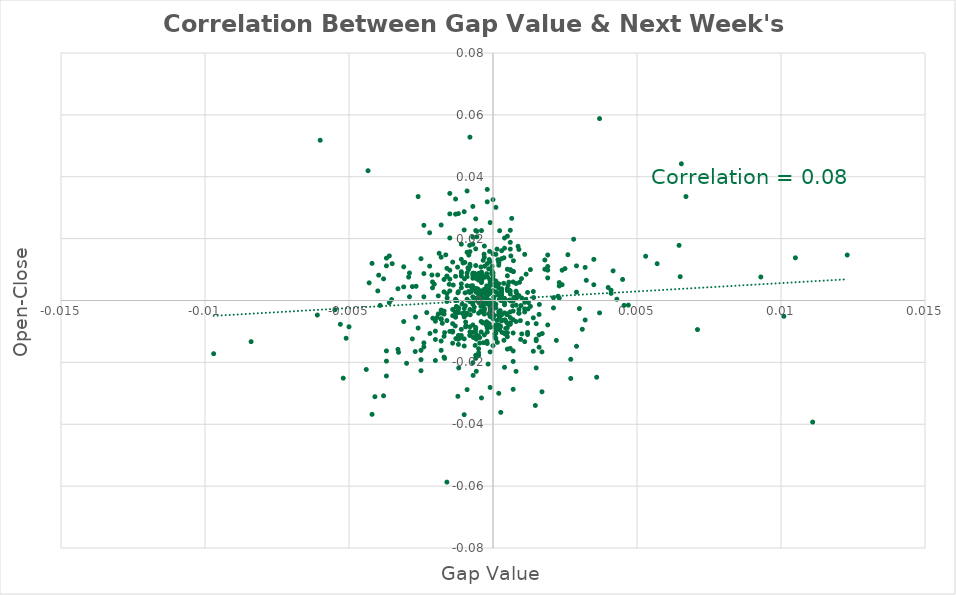
| Category | Series 0 |
|---|---|
| -0.00107000000000001 | -0.001 |
| -0.000199999999999978 | 0 |
| -0.000219999999999998 | 0.009 |
| -2.99999999999744e-05 | 0.01 |
| -0.000619999999999953 | -0.015 |
| -0.00168000000000001 | -0.019 |
| -0.000559999999999893 | 0.022 |
| -0.000340000000000007 | -0.002 |
| -0.00126999999999999 | -0.002 |
| 0.000290000000000012 | 0.002 |
| 0.00048999999999999 | 0.004 |
| -0.000630000000000019 | 0.009 |
| -0.000580000000000024 | 0.003 |
| -0.00152000000000007 | 0.005 |
| 0.000439999999999995 | -0.011 |
| 0.000229999999999952 | 0.023 |
| -0.00119999999999997 | 0.003 |
| 0.000249999999999972 | -0.003 |
| -0.000170000000000003 | 0.002 |
| -0.000750000000000028 | 0.005 |
| 0.000990000000000046 | 0.007 |
| 0.000379999999999935 | -0.013 |
| -0.000850000000000017 | 0.003 |
| -0.000650000000000039 | -0.002 |
| -0.000460000000000016 | -0.012 |
| -0.000359999999999915 | -0.002 |
| -0.000809999999999977 | 0.003 |
| -0.00292999999999998 | 0.008 |
| 2.99999999999744e-05 | 0.001 |
| 0.000950000000000006 | -0.007 |
| 0.000240000000000018 | 0.002 |
| 0.000140000000000029 | 0.017 |
| 5.99999999999489e-05 | -0.011 |
| -0.0011000000000001 | -0.009 |
| -0.00194000000000005 | -0.005 |
| -0.000390000000000001 | 0.007 |
| -3.99999999999289e-05 | -0.001 |
| -0.00138000000000004 | 0.005 |
| -0.000219999999999998 | -0.007 |
| 9.99999999999889e-05 | -0.01 |
| -0.00392000000000003 | -0.002 |
| 0.00149999999999994 | -0.007 |
| 0.000309999999999921 | -0.01 |
| 0.000480000000000036 | -0.005 |
| -0.000210000000000043 | -0.008 |
| -0.000340000000000007 | -0.004 |
| 0.00113999999999991 | 0 |
| -0.000689999999999968 | -0.024 |
| -2.99999999999744e-05 | 0.011 |
| -0.000950000000000006 | -0.007 |
| -0.00163999999999997 | 0.015 |
| -0.000230000000000063 | -0.008 |
| -0.000329999999999941 | -0.014 |
| 0.000650000000000039 | 0.027 |
| -0.000960000000000071 | -0.002 |
| -0.000280000000000058 | 0 |
| -0.000990000000000046 | 0.007 |
| -0.00119000000000002 | -0.022 |
| -0.0012899999999999 | 0 |
| -0.000109999999999943 | -0.001 |
| -0.00170000000000003 | -0.003 |
| -0.00209000000000003 | -0.006 |
| -0.00114999999999998 | -0.012 |
| -2.000000000002e-05 | -0.005 |
| -0.00127999999999994 | -0.002 |
| -0.000800000000000022 | -0.009 |
| -0.00268999999999997 | -0.005 |
| -0.00352000000000007 | 0 |
| -0.00048999999999999 | 0.009 |
| -0.00121999999999999 | -0.031 |
| -0.000460000000000016 | -0.014 |
| 7.00000000000145e-05 | -0.012 |
| -0.000870000000000037 | 0.011 |
| -0.00129000000000001 | -0.012 |
| -0.00190000000000001 | -0.004 |
| -0.000310000000000032 | -0.004 |
| -0.000419999999999975 | -0.002 |
| 0.00146999999999997 | -0.034 |
| -0.00186999999999992 | 0.015 |
| 0.000269999999999992 | -0.036 |
| 0.00653999999999999 | 0.044 |
| -0.00433999999999989 | 0.042 |
| -0.00327999999999995 | -0.017 |
| -0.00397000000000002 | 0.008 |
| 0.000710000000000099 | 0.009 |
| -0.00097999999999998 | -0.005 |
| -0.000369999999999981 | 0.001 |
| -0.00139999999999995 | 0.012 |
| -0.000219999999999998 | 0.005 |
| -0.000249999999999972 | 0.002 |
| -0.000719999999999942 | 0.004 |
| -0.000129999999999963 | 0.003 |
| -0.000600000000000044 | -0.009 |
| 0.000969999999999915 | -0.002 |
| -0.00106000000000006 | -0.004 |
| 0.00119999999999997 | -0.007 |
| 0.000560000000000004 | 0.003 |
| -0.000750000000000028 | 0.003 |
| -0.000329999999999941 | 0.003 |
| 9.99999999999889e-05 | 0.006 |
| 0.000200000000000089 | -0.009 |
| -0.000969999999999915 | 0.002 |
| -0.000410000000000021 | -0.007 |
| -0.00125000000000008 | -0.004 |
| -0.000369999999999981 | 0 |
| 0.000800000000000022 | 0.001 |
| -0.00150000000000005 | 0.01 |
| -0.00119999999999997 | -0.004 |
| -0.00121000000000004 | -0.013 |
| -0.00126999999999999 | 0 |
| 9.99999999999889e-05 | 0.003 |
| -0.000329999999999941 | 0 |
| -0.000560000000000004 | 0.001 |
| -0.000419999999999975 | 0.011 |
| -0.000340000000000007 | 0.013 |
| 2.99999999999744e-05 | -0.002 |
| -0.000140000000000029 | -0.004 |
| 0.000520000000000076 | 0.005 |
| 0.000439999999999995 | -0.009 |
| 0.000219999999999998 | -0.005 |
| 0.000170000000000003 | 0.013 |
| 0.000139999999999918 | -0.006 |
| 0.000599999999999933 | 0 |
| 0.00455000000000005 | -0.002 |
| -0.00097999999999998 | 0.012 |
| -0.00548999999999999 | -0.003 |
| -0.000219999999999998 | 0.001 |
| -0.000290000000000012 | 0.011 |
| -0.000149999999999983 | 0.002 |
| -0.000360000000000027 | -0.007 |
| 0.00225999999999992 | 0.001 |
| 3.00000000000855e-05 | -0.001 |
| 0.000220000000000109 | 0 |
| -0.000789999999999957 | -0.005 |
| 0.00324000000000002 | 0.007 |
| 0.000920000000000031 | 0.006 |
| -0.000390000000000001 | 0.001 |
| -9.99999999999889e-05 | -0.005 |
| -0.000120000000000009 | 0.016 |
| -0.000340000000000007 | -0.007 |
| 0.000400000000000067 | -0.001 |
| -0.000709999999999988 | 0.005 |
| -0.000410000000000021 | -0.01 |
| 0.000529999999999919 | -0.008 |
| 0.000569999999999959 | 0 |
| -0.000300000000000078 | 0.014 |
| -0.00158999999999998 | 0.001 |
| 0.00646000000000002 | 0.018 |
| 4.99999999999944e-05 | -0.009 |
| -0.00212000000000001 | 0.008 |
| -0.000569999999999959 | -0.011 |
| -0.000670000000000059 | -0.003 |
| 0.000400000000000067 | -0.011 |
| -0.000580000000000024 | 0.003 |
| -0.00046999999999997 | -0.001 |
| 0.000410000000000021 | -0.006 |
| 0.000870000000000037 | 0.018 |
| -0.00266999999999995 | 0.005 |
| 0.000149999999999983 | -0.014 |
| 4.000000000004e-05 | -0.005 |
| -4.99999999999944e-05 | 0.009 |
| -0.000129999999999963 | 0.013 |
| -0.000329999999999941 | -0.001 |
| -0.00180000000000002 | -0.004 |
| -0.000149999999999983 | 0.01 |
| -0.000240000000000018 | 0 |
| 0.000159999999999938 | 0.002 |
| -0.000399999999999955 | 0 |
| 0.000719999999999942 | 0.001 |
| -4.000000000004e-05 | -0.002 |
| -0.000459999999999904 | 0.003 |
| -0.000139999999999918 | 0 |
| -0.000839999999999951 | 0.015 |
| -0.000430000000000041 | -0.003 |
| 0.00122999999999995 | -0.001 |
| 0.00121999999999999 | -0.003 |
| 0.0 | 0.003 |
| 0.000290000000000012 | 0 |
| -0.000539999999999984 | 0.004 |
| -0.000380000000000047 | 0.008 |
| 0.000609999999999999 | 0.01 |
| 0.000260000000000038 | -0.008 |
| 0.000829999999999997 | 0.001 |
| 0.000809999999999977 | 0.002 |
| 0.000179999999999958 | 0.002 |
| 0.000379999999999935 | 0.014 |
| -9.00000000000345e-05 | -0.009 |
| -0.000190000000000023 | 0.008 |
| -0.000109999999999943 | 0.007 |
| 0.000229999999999952 | -0.009 |
| -0.000849999999999906 | 0.01 |
| -0.000809999999999977 | 0.018 |
| 0.00170999999999998 | -0.011 |
| -0.00131000000000003 | -0.008 |
| 0.0 | -0.005 |
| 0.000480000000000036 | -0.007 |
| -0.000210000000000043 | -0.013 |
| -0.00192000000000003 | 0.008 |
| 0.000400000000000067 | 0 |
| 0.000189999999999912 | -0.005 |
| -0.000690000000000079 | 0.009 |
| 2.000000000002e-05 | -0.001 |
| -0.000390000000000001 | 0.002 |
| 0.000619999999999953 | 0.014 |
| -0.000540000000000096 | 0.007 |
| -0.000680000000000013 | -0.012 |
| 0.000549999999999939 | 0.006 |
| -0.00103999999999993 | 0.012 |
| -0.000279999999999947 | 0.004 |
| 0.000370000000000092 | 0.006 |
| -0.00219000000000002 | -0.011 |
| -0.000950000000000006 | -0.005 |
| -6.000000000006e-05 | -0.001 |
| -7.00000000000145e-05 | -0.004 |
| -0.00121999999999999 | 0.003 |
| -0.000900000000000011 | 0.005 |
| -0.000940000000000051 | -0.008 |
| -8.99999999999234e-05 | -0.009 |
| -0.000580000000000024 | -0.023 |
| -0.00051000000000001 | 0.008 |
| -0.000580000000000024 | -0.013 |
| -0.000109999999999943 | 0.005 |
| 0.000249999999999972 | -0.009 |
| -0.00168000000000001 | -0.01 |
| -0.000800000000000022 | 0 |
| -0.000630000000000019 | 0 |
| 0.000430000000000041 | -0.007 |
| -0.000400000000000067 | 0.002 |
| -0.00204000000000004 | 0.005 |
| 0.00417 | 0.01 |
| -0.000199999999999978 | 0.003 |
| -0.000950000000000006 | -0.009 |
| -0.000110000000000054 | 0.013 |
| 0.00141000000000002 | 0.001 |
| -0.000369999999999981 | 0.008 |
| 0.000500000000000056 | -0.016 |
| -0.000770000000000048 | 0.005 |
| 0.00115000000000009 | 0.009 |
| 0.000279999999999947 | 0 |
| 0.000279999999999947 | 0.001 |
| -0.000569999999999959 | 0 |
| 0.00095999999999996 | -0.013 |
| -0.000379999999999935 | 0 |
| -0.00175999999999998 | -0.007 |
| -0.000170000000000003 | -0.021 |
| -0.000699999999999922 | -0.01 |
| -0.00130999999999992 | -0.004 |
| -0.00122999999999995 | 0.011 |
| -0.000309999999999921 | 0.015 |
| -0.000589999999999979 | 0 |
| 0.000680000000000013 | -0.002 |
| -0.000609999999999999 | -0.01 |
| -0.000560000000000004 | 0.021 |
| 0.000709999999999988 | 0.013 |
| -0.000129999999999963 | -0.007 |
| 3.00000000000855e-05 | 0.001 |
| 0.000269999999999992 | 0.001 |
| 0.00161 | -0.001 |
| 0.0 | 0.007 |
| -0.000499999999999944 | -0.004 |
| -0.00119999999999997 | -0.014 |
| 9.99999999999889e-05 | 0.005 |
| -0.000299999999999967 | 0.003 |
| -0.000399999999999955 | -0.001 |
| -0.00209999999999999 | 0.004 |
| 0.000599999999999933 | 0.003 |
| -0.0001000000000001 | -0.003 |
| -0.001 | -0.003 |
| -0.000199999999999978 | -0.014 |
| 0.00179999999999991 | 0.013 |
| -0.000200000000000089 | -0.001 |
| -0.00509999999999999 | -0.012 |
| -0.00529999999999997 | -0.008 |
| 0.00369999999999992 | -0.004 |
| -9.99999999999889e-05 | -0.002 |
| 0.000399999999999955 | -0.001 |
| -0.000600000000000044 | -0.019 |
| 0.000200000000000089 | 0.004 |
| -0.00150000000000005 | 0.003 |
| -0.00109999999999999 | 0.009 |
| -0.001 | 0.023 |
| -0.00109999999999999 | 0.009 |
| -0.00609999999999999 | -0.005 |
| -0.000600000000000044 | -0.018 |
| -0.000799999999999911 | 0.012 |
| 0.000699999999999922 | -0.016 |
| -0.000700000000000033 | 0.009 |
| -0.00129999999999996 | -0.005 |
| -0.00330000000000008 | -0.016 |
| -0.000400000000000067 | -0.032 |
| 0.000800000000000022 | 0.003 |
| -0.000299999999999967 | -0.004 |
| 0.000599999999999933 | -0.004 |
| -0.000200000000000089 | 0.002 |
| 9.99999999999889e-05 | -0.008 |
| -0.00179999999999991 | -0.016 |
| 0.00190000000000001 | 0.011 |
| -0.00259999999999993 | 0.034 |
| 0.000700000000000033 | -0.003 |
| -0.000199999999999978 | -0.01 |
| 0.00139999999999995 | 0.003 |
| 0.0 | 0.015 |
| 0.0 | -0.015 |
| -0.000700000000000033 | 0.004 |
| -0.000500000000000056 | -0.012 |
| -0.00149999999999994 | -0.01 |
| -0.00160000000000004 | 0.008 |
| -0.000700000000000033 | 0.007 |
| -0.00109999999999999 | 0.004 |
| -0.00109999999999999 | 0.005 |
| -9.99999999999889e-05 | -0.028 |
| -9.99999999999889e-05 | -0.002 |
| -0.0008999999999999 | 0.016 |
| -0.00109999999999999 | -0.011 |
| 0.00170000000000003 | -0.017 |
| -0.00180000000000002 | 0.024 |
| -0.00109999999999999 | 0.013 |
| 9.99999999999889e-05 | 0.006 |
| -0.000600000000000044 | 0.004 |
| 0.001 | -0.011 |
| -0.00119999999999997 | -0.003 |
| 0.000700000000000033 | 0.009 |
| -0.00279999999999991 | 0.005 |
| -0.004 | 0.003 |
| -0.00309999999999999 | 0.011 |
| -0.000800000000000022 | 0.011 |
| 0.00209999999999999 | -0.002 |
| 0.000499999999999944 | -0.01 |
| -0.000499999999999944 | 0.002 |
| -0.000700000000000033 | 0.018 |
| 0.000499999999999944 | 0.021 |
| -0.00119999999999997 | -0.011 |
| -0.00139999999999995 | -0.01 |
| 9.99999999999889e-05 | -0.002 |
| 0.00429999999999997 | 0 |
| -0.000799999999999911 | -0.011 |
| 0.00109999999999999 | -0.004 |
| -0.00160000000000004 | 0.01 |
| 0.00229999999999996 | 0.005 |
| -0.001 | -0.015 |
| -0.000299999999999967 | 0.008 |
| -0.000400000000000067 | 0.009 |
| 0.000299999999999967 | 0.004 |
| 0.000600000000000044 | -0.007 |
| -0.00359999999999993 | -0.001 |
| -0.001 | -0.004 |
| -0.00370000000000003 | 0.011 |
| -0.000700000000000033 | 0.03 |
| 0.000799999999999911 | -0.002 |
| -0.00239999999999995 | -0.014 |
| 0.000300000000000078 | 0.003 |
| -9.99999999999889e-05 | 0.002 |
| 0.000500000000000056 | 0.01 |
| -0.00170000000000003 | 0.007 |
| -0.00360000000000004 | 0.014 |
| 0.000399999999999955 | 0.017 |
| 0.00249999999999994 | 0.01 |
| 0.00120000000000009 | -0.01 |
| -0.00419999999999998 | 0.012 |
| 0.000399999999999955 | 0.001 |
| 0.000900000000000011 | -0.004 |
| 0.000599999999999933 | -0.006 |
| 0.0001000000000001 | -0.001 |
| -0.00109999999999999 | 0.008 |
| 0.000600000000000044 | 0.017 |
| -0.00239999999999995 | 0.009 |
| -0.00129999999999996 | 0.033 |
| -0.00129999999999996 | -0.005 |
| -0.000800000000000022 | -0.003 |
| -0.000399999999999955 | 0 |
| 0.0 | -0.004 |
| -0.000499999999999944 | 0.004 |
| 0.0 | 0.008 |
| 0.000299999999999967 | 0 |
| -0.000699999999999922 | -0.001 |
| -0.000300000000000078 | -0.003 |
| -9.99999999999889e-05 | 0.006 |
| -0.000900000000000011 | -0.005 |
| 0.000300000000000078 | 0.002 |
| 0.000299999999999967 | -0.006 |
| -0.000300000000000078 | -0.003 |
| 0.000199999999999978 | -0.008 |
| 0.000299999999999967 | 0.013 |
| -0.000199999999999978 | -0.001 |
| 0.000600000000000044 | -0.008 |
| -0.000699999999999922 | 0 |
| 0.0 | 0.005 |
| -0.000400000000000067 | 0.006 |
| -0.000800000000000022 | -0.011 |
| 0.000400000000000067 | -0.004 |
| 0.00159999999999993 | -0.015 |
| -0.00160000000000004 | -0.007 |
| -0.00160000000000004 | 0.002 |
| -0.00270000000000003 | -0.017 |
| -0.000599999999999933 | 0.004 |
| 0.00190000000000001 | 0.007 |
| -0.000700000000000033 | -0.008 |
| 0.000700000000000033 | -0.02 |
| 0.000700000000000033 | -0.006 |
| -0.000900000000000011 | 0.009 |
| -0.000699999999999922 | 0.021 |
| 0.000300000000000078 | -0.005 |
| -0.002 | -0.01 |
| 0.000199999999999978 | 0.005 |
| -0.00170000000000003 | 0.003 |
| 0.00109999999999999 | 0.015 |
| 0.0008999999999999 | 0.002 |
| -0.000400000000000067 | 0.006 |
| 0.000400000000000067 | 0.02 |
| -0.000400000000000067 | 0.001 |
| 0.000700000000000033 | 0.006 |
| 9.99999999999889e-05 | 0.015 |
| -0.00130000000000007 | 0.008 |
| -0.00369999999999992 | -0.024 |
| 0.000200000000000089 | -0.004 |
| -0.001 | -0.012 |
| -0.00209999999999999 | 0.006 |
| 0.0101 | -0.005 |
| 0.00160000000000004 | -0.004 |
| 0.00270000000000003 | -0.025 |
| 0.000199999999999978 | 0.012 |
| 0.000299999999999967 | 0.016 |
| -0.00159999999999993 | 0 |
| 0.000700000000000033 | -0.029 |
| -0.000900000000000011 | 0.035 |
| 0.000499999999999944 | -0.009 |
| 0.0031000000000001 | -0.009 |
| -0.00129999999999996 | 0 |
| -0.000499999999999944 | 0.007 |
| 0.00239999999999995 | 0.01 |
| -0.000199999999999978 | 0.036 |
| -0.00970000000000004 | -0.017 |
| 0.00320000000000009 | 0.011 |
| 0.000499999999999944 | 0.008 |
| 0.00290000000000001 | 0.011 |
| -0.00150000000000005 | 0.028 |
| -0.00120000000000009 | 0.028 |
| 0.0008999999999999 | -0.003 |
| -0.000199999999999978 | 0 |
| -0.000599999999999933 | 0.023 |
| -0.00140000000000006 | -0.014 |
| -0.000800000000000133 | 0.003 |
| 0.000299999999999967 | 0.003 |
| -0.00499999999999989 | -0.008 |
| -0.00300000000000011 | -0.02 |
| -0.000399999999999955 | -0.004 |
| -0.00290000000000012 | 0.009 |
| -0.00229999999999996 | -0.004 |
| -0.000900000000000122 | 0 |
| 0.00130000000000007 | 0.01 |
| -0.000699999999999922 | 0.001 |
| -0.0008999999999999 | 0.008 |
| -0.000299999999999967 | 0.002 |
| 0.00299999999999989 | -0.003 |
| 9.99999999999889e-05 | -0.011 |
| 0.000499999999999944 | 0.003 |
| -0.000799999999999911 | 0.016 |
| -0.000199999999999978 | -0.008 |
| 0.0 | -0.006 |
| -0.000199999999999978 | 0.003 |
| 0.00119999999999986 | -0.011 |
| 0.000799999999999911 | 0.005 |
| 0.000499999999999944 | -0.004 |
| -0.00239999999999995 | 0.001 |
| -0.000999999999999889 | -0.005 |
| 0.00190000000000001 | -0.008 |
| -0.002 | -0.007 |
| -0.0011000000000001 | 0.018 |
| -0.000600000000000156 | 0.007 |
| 0.000600000000000156 | 0.01 |
| -0.00170000000000003 | -0.018 |
| -0.00259999999999993 | -0.009 |
| 0.00180000000000002 | 0.01 |
| 0.00119999999999986 | 0.003 |
| -0.00180000000000002 | 0.014 |
| 0.000699999999999922 | 0 |
| -0.00140000000000006 | -0.01 |
| -0.002 | -0.013 |
| 0.00219999999999998 | -0.013 |
| -0.00139999999999984 | -0.003 |
| 0.00239999999999995 | 0.005 |
| -0.002 | -0.019 |
| 0.00350000000000005 | 0.005 |
| 0.0071000000000001 | -0.009 |
| 0.000399999999999955 | -0.022 |
| 0.00569999999999992 | 0.012 |
| -0.000700000000000033 | 0.008 |
| -0.000599999999999933 | 0.017 |
| -0.00249999999999994 | 0.014 |
| -0.00129999999999985 | 0.028 |
| -0.000800000000000133 | -0.01 |
| 0.0 | -0.001 |
| -0.00139999999999984 | -0.007 |
| 0.0104999999999999 | 0.014 |
| -0.000199999999999978 | 0.012 |
| 0.000199999999999978 | 0.013 |
| -0.00180000000000002 | -0.003 |
| 0.000900000000000122 | 0.016 |
| 0.0011000000000001 | -0.003 |
| 0.00649999999999995 | 0.008 |
| 0.00130000000000007 | -0.002 |
| -0.00160000000000004 | 0.008 |
| -0.00180000000000002 | -0.013 |
| -0.000499999999999944 | -0.018 |
| -0.00370000000000003 | -0.02 |
| -0.00279999999999991 | -0.012 |
| 0.0011000000000001 | -0.001 |
| 0.000299999999999967 | -0.007 |
| 0.000600000000000044 | -0.015 |
| -0.000399999999999955 | 0.023 |
| 0.004 | 0.004 |
| 0.0111 | -0.039 |
| -0.000999999999999889 | 0.029 |
| 0.00669999999999992 | 0.034 |
| 0.00349999999999983 | 0.013 |
| 0.0 | 0.033 |
| -0.0042000000000002 | -0.037 |
| -0.00140000000000006 | -0.005 |
| -0.00160000000000004 | -0.059 |
| -0.000299999999999967 | -0.011 |
| 0.00260000000000004 | 0.015 |
| -0.006 | 0.052 |
| -0.00380000000000002 | 0.007 |
| -0.00370000000000003 | 0.014 |
| 0.00140000000000006 | -0.006 |
| -0.00249999999999994 | -0.019 |
| 0.0008999999999999 | -0.004 |
| -0.00150000000000005 | 0.007 |
| 0.00370000000000003 | 0.059 |
| -0.00249999999999994 | -0.016 |
| -0.00249999999999994 | -0.023 |
| -0.00429999999999997 | 0.006 |
| 0.000599999999999933 | 0.002 |
| -0.0008999999999999 | -0.029 |
| -0.00219999999999998 | 0.011 |
| -0.000600000000000156 | -0.009 |
| -0.000299999999999967 | 0.018 |
| 0.00229999999999996 | 0.001 |
| -0.00180000000000002 | -0.006 |
| 0.000199999999999978 | -0.009 |
| 0.00190000000000001 | 0.015 |
| -0.000599999999999933 | 0.026 |
| 0.000800000000000133 | -0.023 |
| -0.000499999999999944 | -0.017 |
| 0.0 | 0 |
| 0.00140000000000006 | -0.016 |
| -0.00239999999999995 | -0.015 |
| 0.000199999999999978 | -0.03 |
| 0.000599999999999933 | 0.019 |
| 0.000999999999999889 | 0.001 |
| -0.00290000000000012 | 0.001 |
| -0.0008999999999999 | -0.004 |
| -0.00370000000000003 | -0.016 |
| -0.000599999999999933 | 0.011 |
| -0.00519999999999998 | -0.025 |
| -0.00180000000000002 | -0.006 |
| 0.00209999999999999 | 0.001 |
| -0.00330000000000008 | 0.004 |
| -0.00239999999999995 | 0.024 |
| -0.00439999999999995 | -0.022 |
| -9.99999999999889e-05 | -0.017 |
| -0.00169999999999992 | -0.004 |
| -0.00309999999999999 | 0.004 |
| 0.00359999999999993 | -0.025 |
| 0.000599999999999933 | 0.023 |
| 0.00409999999999999 | 0.002 |
| 9.99999999999889e-05 | 0.03 |
| 0.00169999999999992 | -0.029 |
| 0.00409999999999999 | 0.003 |
| 0.0018999999999999 | 0.01 |
| 0.00470000000000003 | -0.002 |
| 9.99999999999889e-05 | -0.012 |
| 0.00159999999999993 | -0.011 |
| 0.00150000000000005 | -0.022 |
| 0.00319999999999998 | -0.006 |
| -0.00170000000000003 | -0.012 |
| 0.0028999999999999 | -0.015 |
| -0.00840000000000007 | -0.013 |
| -0.00120000000000009 | -0.002 |
| -9.99999999999889e-05 | 0.025 |
| 0.00149999999999994 | -0.013 |
| -0.000199999999999978 | -0.009 |
| -0.00379999999999991 | -0.031 |
| 0.0 | 0.009 |
| -0.001 | -0.037 |
| -0.000200000000000089 | 0.032 |
| 0.00929999999999997 | 0.008 |
| 0.00270000000000003 | -0.019 |
| -0.0041000000000001 | -0.031 |
| -0.00219999999999998 | 0.022 |
| -0.000499999999999944 | -0.016 |
| -0.000800000000000022 | 0.053 |
| 0.0122999999999999 | 0.015 |
| -0.00150000000000005 | 0.035 |
| -0.00190000000000001 | 0.001 |
| -0.0031000000000001 | -0.007 |
| 0.00530000000000008 | 0.014 |
| 0.00150000000000005 | -0.013 |
| 0.00109999999999999 | -0.013 |
| 0.000199999999999978 | 0.011 |
| 0.00290000000000001 | 0.003 |
| 0.000800000000000022 | -0.007 |
| 0.000500000000000056 | -0.012 |
| 0.00229999999999996 | 0.006 |
| 0.000700000000000033 | -0.011 |
| -0.000700000000000033 | -0.02 |
| -0.00349999999999994 | 0.012 |
| 0.00280000000000002 | 0.02 |
| -0.00150000000000005 | 0.02 |
| 0.00450000000000006 | 0.007 |